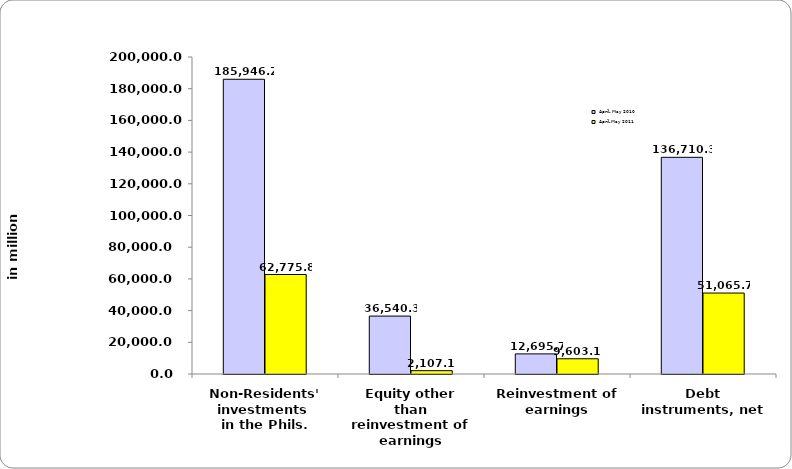
| Category | April- May 2010 | April-May 2011 |
|---|---|---|
| Non-Residents' investments 
in the Phils. | 185946.241 | 62775.847 |
| Equity other than reinvestment of earnings | 36540.286 | 2107.09 |
| Reinvestment of earnings | 12695.702 | 9603.101 |
| Debt instruments, net | 136710.252 | 51065.656 |